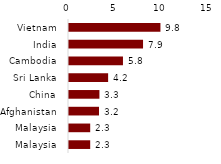
| Category | Series 0 |
|---|---|
| Vietnam | 9.797 |
| India | 7.933 |
| Cambodia | 5.782 |
| Sri Lanka | 4.192 |
| China | 3.259 |
| Afghanistan | 3.214 |
| Malaysia | 2.272 |
| Malaysia | 2.272 |